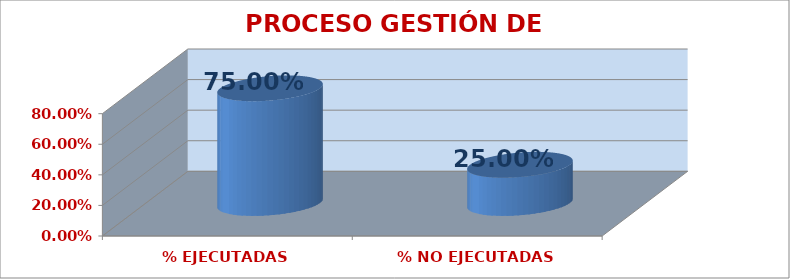
| Category | PROCESO GESTIÓN DE AULA |
|---|---|
| % EJECUTADAS | 0.75 |
| % NO EJECUTADAS | 0.25 |